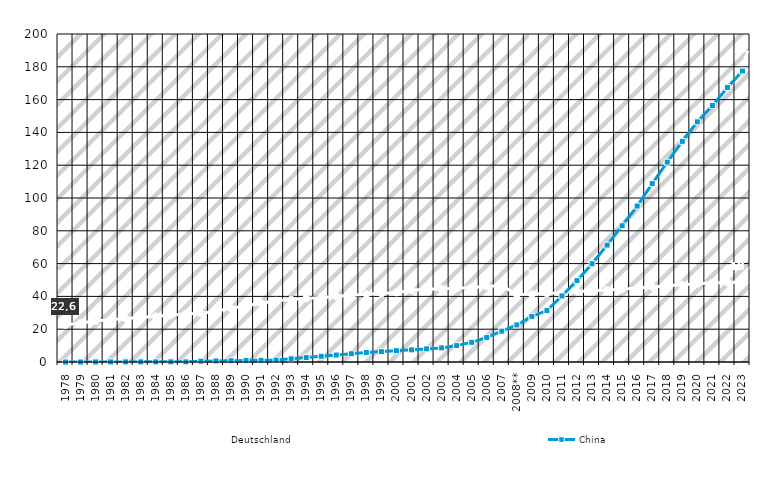
| Category | Deutschland | China |
|---|---|---|
| 1978 | 22.613 | 0 |
| 1979 | 23.809 | 0 |
| 1980 | 25.005 | 0.05 |
| 1981 | 25.768 | 0.06 |
| 1982 | 26.46 | 0.07 |
| 1983 | 27.151 | 0.08 |
| 1984 | 27.842 | 0.09 |
| 1985 | 28.534 | 0.1 |
| 1986 | 29.405 | 0.1 |
| 1987 | 29.561 | 0.513 |
| 1988 | 31.131 | 0.643 |
| 1989 | 32.7 | 0.773 |
| 1990 | 34.27 | 0.904 |
| 1991 | 35.839 | 1.034 |
| 1992 | 37.409 | 1.164 |
| 1993 | 38.062 | 1.938 |
| 1994 | 38.715 | 2.711 |
| 1995 | 39.368 | 3.485 |
| 1996 | 40.02 | 4.259 |
| 1997 | 40.673 | 5.032 |
| 1998 | 41.326 | 5.806 |
| 1999 | 41.716 | 6.338 |
| 2000 | 42.423 | 6.87 |
| 2001 | 43.772 | 7.402 |
| 2002 | 44.383 | 8 |
| 2003 | 44.657 | 8.6 |
| 2004 | 45.022 | 10 |
| 2005 | 45.375 | 12 |
| 2006 | 46.09 | 15 |
| 2007 | 46.569 | 18.8 |
| 2008** | 41.183 | 22.6 |
| 2009 | 41.321 | 27.8 |
| 2010 | 41.737 | 31.36 |
| 2011 | 42.301 | 40.29 |
| 2012 | 42.927 | 49.62 |
| 2013 | 43.431 | 59.89 |
| 2014 | 43.851 | 71.26 |
| 2015 | 44.403 | 83.07 |
| 2016 | 45.071 | 95.08 |
| 2017 | 45.804 | 108.76 |
| 2018 | 46.475 | 121.85 |
| 2019 | 47.096 | 134.51 |
| 2020 | 47.716 | 146.44 |
| 2021 | 48.249 | 156.4 |
| 2022 | 48.541 | 167.39 |
| 2023 | 48.763 | 177.4 |